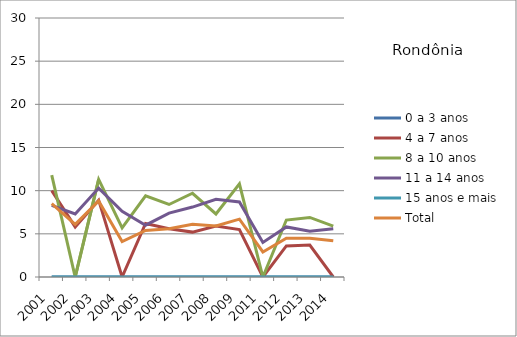
| Category | 0 a 3 anos | 4 a 7 anos | 8 a 10 anos | 11 a 14 anos | 15 anos e mais | Total |
|---|---|---|---|---|---|---|
| 2001.0 | 0 | 10 | 11.8 | 8.3 | 0 | 8.5 |
| 2002.0 | 0 | 5.8 | 0 | 7.3 | 0 | 6.1 |
| 2003.0 | 0 | 8.9 | 11.3 | 10.3 | 0 | 8.8 |
| 2004.0 | 0 | 0 | 5.7 | 7.6 | 0 | 4.1 |
| 2005.0 | 0 | 6.2 | 9.4 | 6 | 0 | 5.4 |
| 2006.0 | 0 | 5.6 | 8.4 | 7.4 | 0 | 5.6 |
| 2007.0 | 0 | 5.2 | 9.7 | 8.1 | 0 | 6.1 |
| 2008.0 | 0 | 5.9 | 7.3 | 9 | 0 | 5.9 |
| 2009.0 | 0 | 5.5 | 10.8 | 8.7 | 0 | 6.7 |
| 2011.0 | 0 | 0 | 0 | 4 | 0 | 2.9 |
| 2012.0 | 0 | 3.6 | 6.6 | 5.8 | 0 | 4.5 |
| 2013.0 | 0 | 3.7 | 6.9 | 5.3 | 0 | 4.5 |
| 2014.0 | 0 | 0 | 5.9 | 5.6 | 0 | 4.2 |